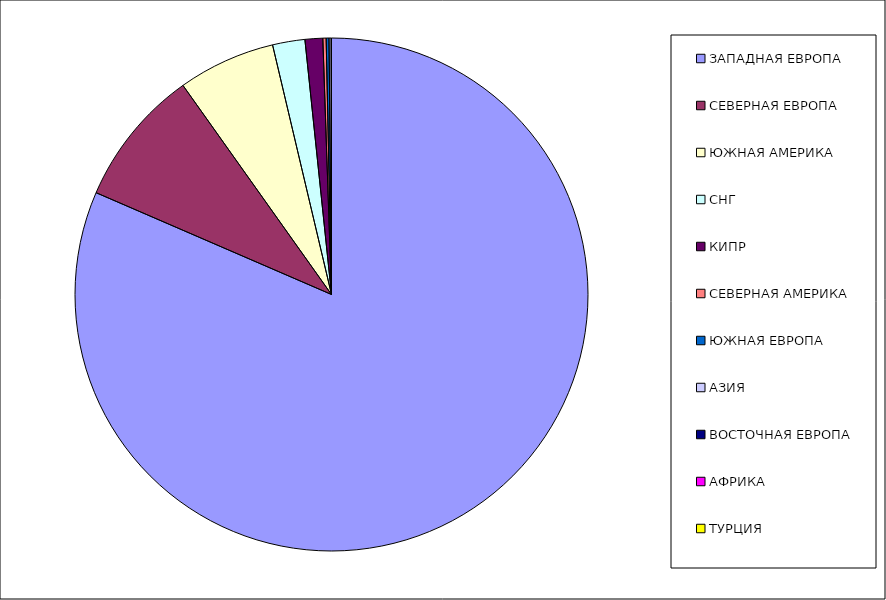
| Category | Оборот |
|---|---|
| ЗАПАДНАЯ ЕВРОПА | 0.815 |
| СЕВЕРНАЯ ЕВРОПА | 0.087 |
| ЮЖНАЯ АМЕРИКА | 0.061 |
| СНГ | 0.02 |
| КИПР | 0.011 |
| СЕВЕРНАЯ АМЕРИКА | 0.002 |
| ЮЖНАЯ ЕВРОПА | 0.002 |
| АЗИЯ | 0.001 |
| ВОСТОЧНАЯ ЕВРОПА | 0 |
| АФРИКА | 0 |
| ТУРЦИЯ | 0 |